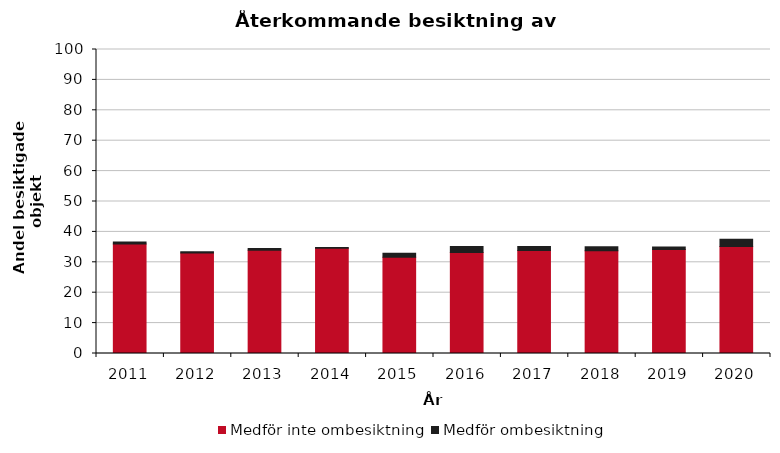
| Category | Medför inte ombesiktning | Medför ombesiktning |
|---|---|---|
| 2011.0 | 36 | 0.7 |
| 2012.0 | 33.1 | 0.4 |
| 2013.0 | 34 | 0.5 |
| 2014.0 | 34.6 | 0.3 |
| 2015.0 | 31.7 | 1.3 |
| 2016.0 | 33.2 | 2 |
| 2017.0 | 33.9 | 1.3 |
| 2018.0 | 33.8 | 1.3 |
| 2019.0 | 34.2 | 0.8 |
| 2020.0 | 35.2 | 2.4 |